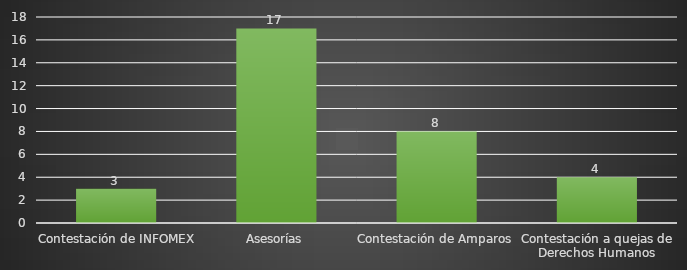
| Category | INDICADOR  |
|---|---|
| Contestación de INFOMEX | 3 |
| Asesorías | 17 |
| Contestación de Amparos | 8 |
| Contestación a quejas de Derechos Humanos | 4 |